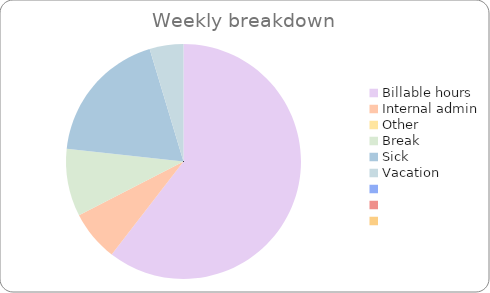
| Category | Total hours |
|---|---|
| Billable hours | 26 |
| Internal admin | 3 |
| Other | 0 |
| Break | 4 |
| Sick | 8 |
| Vacation | 2 |